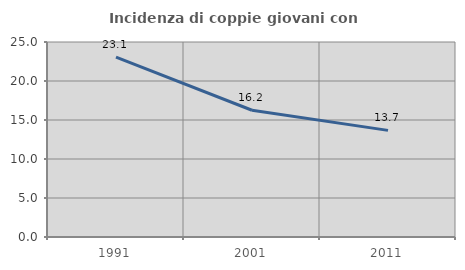
| Category | Incidenza di coppie giovani con figli |
|---|---|
| 1991.0 | 23.069 |
| 2001.0 | 16.249 |
| 2011.0 | 13.672 |